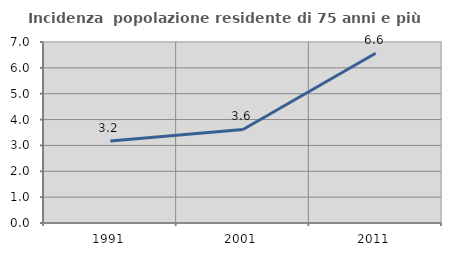
| Category | Incidenza  popolazione residente di 75 anni e più |
|---|---|
| 1991.0 | 3.174 |
| 2001.0 | 3.616 |
| 2011.0 | 6.565 |